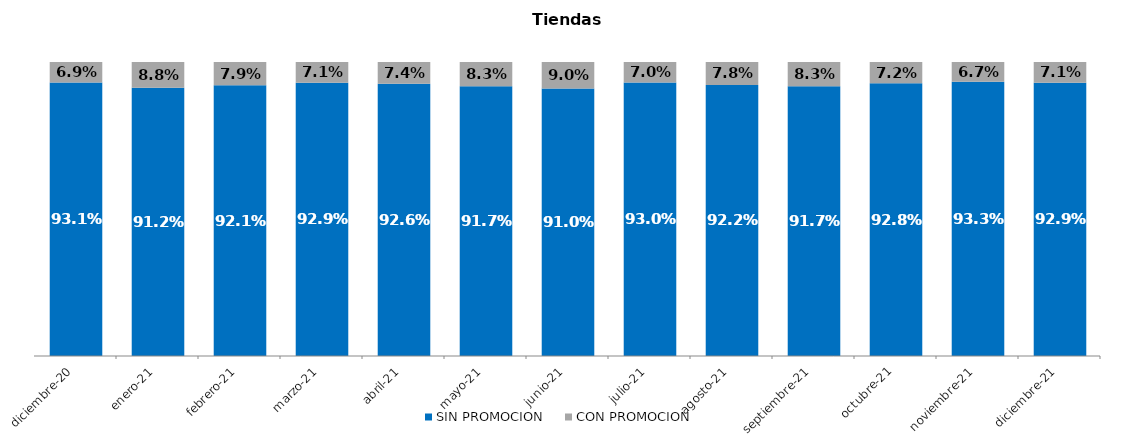
| Category | SIN PROMOCION   | CON PROMOCION   |
|---|---|---|
| 2020-12-01 | 0.931 | 0.069 |
| 2021-01-01 | 0.912 | 0.088 |
| 2021-02-01 | 0.921 | 0.079 |
| 2021-03-01 | 0.929 | 0.071 |
| 2021-04-01 | 0.926 | 0.074 |
| 2021-05-01 | 0.917 | 0.083 |
| 2021-06-01 | 0.91 | 0.09 |
| 2021-07-01 | 0.93 | 0.07 |
| 2021-08-01 | 0.922 | 0.078 |
| 2021-09-01 | 0.917 | 0.083 |
| 2021-10-01 | 0.928 | 0.072 |
| 2021-11-01 | 0.933 | 0.067 |
| 2021-12-01 | 0.929 | 0.071 |